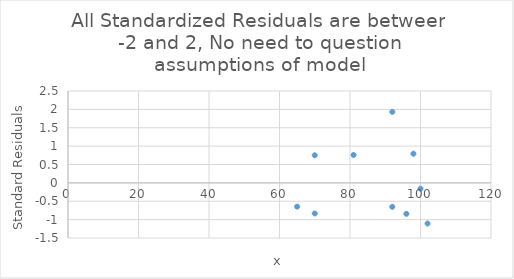
| Category | Standard Residuals |
|---|---|
| 81.0 | 0.759 |
| 96.0 | -0.842 |
| 70.0 | -0.833 |
| 70.0 | 0.751 |
| 92.0 | -0.651 |
| 92.0 | 1.933 |
| 100.0 | -0.157 |
| 98.0 | 0.793 |
| 102.0 | -1.107 |
| 65.0 | -0.647 |